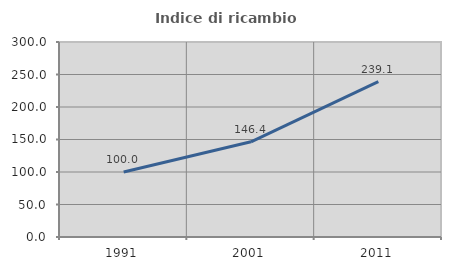
| Category | Indice di ricambio occupazionale  |
|---|---|
| 1991.0 | 100 |
| 2001.0 | 146.429 |
| 2011.0 | 239.13 |